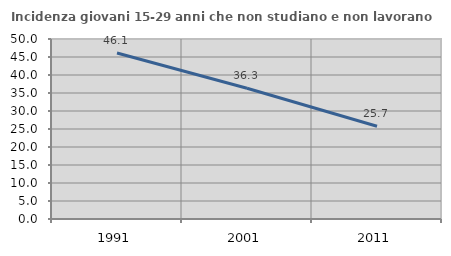
| Category | Incidenza giovani 15-29 anni che non studiano e non lavorano  |
|---|---|
| 1991.0 | 46.128 |
| 2001.0 | 36.321 |
| 2011.0 | 25.746 |